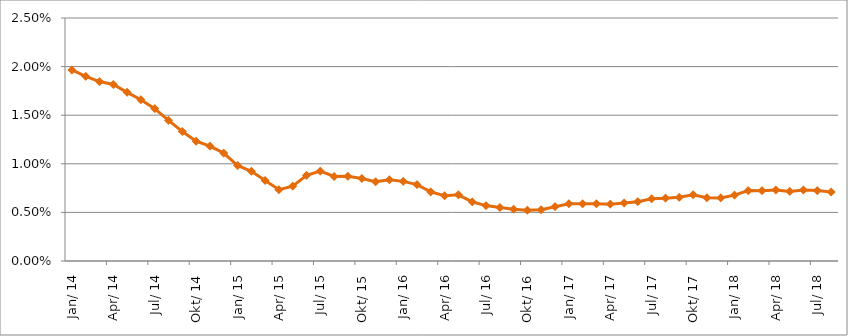
| Category | Durchschnittszins |
|---|---|
| 2014-01-01 | 0.02 |
| 2014-02-01 | 0.019 |
| 2014-03-01 | 0.018 |
| 2014-04-01 | 0.018 |
| 2014-05-01 | 0.017 |
| 2014-06-01 | 0.017 |
| 2014-07-01 | 0.016 |
| 2014-08-01 | 0.014 |
| 2014-09-01 | 0.013 |
| 2014-10-01 | 0.012 |
| 2014-11-01 | 0.012 |
| 2014-12-01 | 0.011 |
| 2015-01-01 | 0.01 |
| 2015-02-01 | 0.009 |
| 2015-03-01 | 0.008 |
| 2015-04-01 | 0.007 |
| 2015-05-01 | 0.008 |
| 2015-06-01 | 0.009 |
| 2015-07-01 | 0.009 |
| 2015-08-01 | 0.009 |
| 2015-09-01 | 0.009 |
| 2015-10-01 | 0.008 |
| 2015-11-01 | 0.008 |
| 2015-12-01 | 0.008 |
| 2016-01-01 | 0.008 |
| 2016-02-01 | 0.008 |
| 2016-03-01 | 0.007 |
| 2016-04-01 | 0.007 |
| 2016-05-01 | 0.007 |
| 2016-06-01 | 0.006 |
| 2016-07-01 | 0.006 |
| 2016-08-01 | 0.005 |
| 2016-09-01 | 0.005 |
| 2016-10-01 | 0.005 |
| 2016-11-01 | 0.005 |
| 2016-12-01 | 0.006 |
| 2017-01-01 | 0.006 |
| 2017-02-01 | 0.006 |
| 2017-03-01 | 0.006 |
| 2017-04-01 | 0.006 |
| 2017-05-01 | 0.006 |
| 2017-06-01 | 0.006 |
| 2017-07-01 | 0.006 |
| 2017-08-01 | 0.006 |
| 2017-09-01 | 0.007 |
| 2017-10-01 | 0.007 |
| 2017-11-01 | 0.007 |
| 2017-12-01 | 0.006 |
| 2018-01-01 | 0.007 |
| 2018-02-01 | 0.007 |
| 2018-03-01 | 0.007 |
| 2018-04-01 | 0.007 |
| 2018-05-01 | 0.007 |
| 2018-06-01 | 0.007 |
| 2018-07-01 | 0.007 |
| 2018-08-01 | 0.007 |